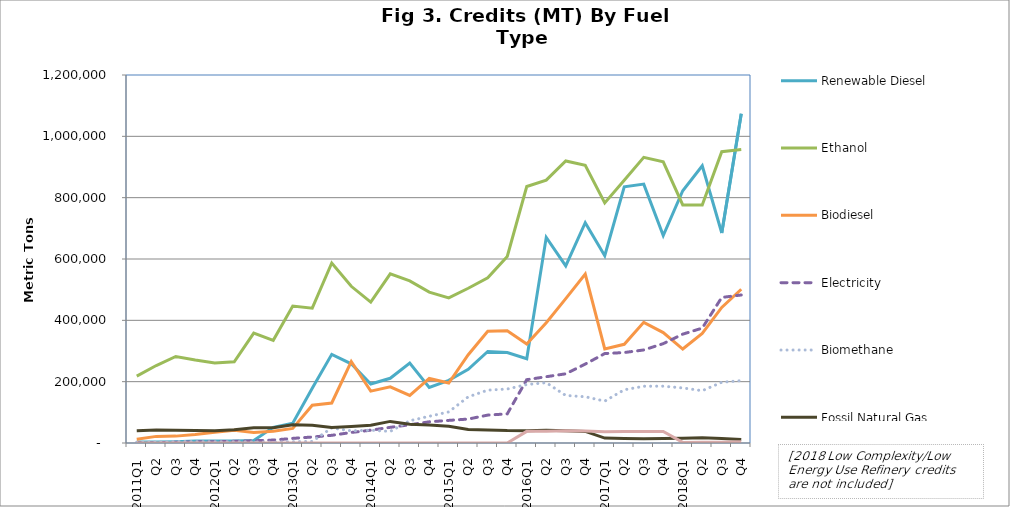
| Category | Renewable Diesel  | Ethanol | Biodiesel | Electricity | Biomethane | Fossil Natural Gas | Other (Hydrogen, Renewable Naphtha, Innovative Crude & Low Complexity / Low Energy Use Refining, etc.) |
|---|---|---|---|---|---|---|---|
| 2011Q1 | 3070 | 217913 | 12300 | 459 | 2212 | 39934 | 0 |
| Q2 | 3368 | 252550 | 21555 | 1293 | 3069 | 42169 | 0 |
| Q3 | 4362 | 282189 | 22424 | 2455 | 4960 | 41443 | 0 |
| Q4 | 6220 | 270901 | 27988 | 3536 | 4474 | 40844 | 0 |
| 2012Q1 | 6701 | 261269 | 35382 | 4519 | 4367 | 40226 | 0 |
| Q2 | 6804 | 264615 | 41919 | 5560 | 4221 | 43158 | 0 |
| Q3 | 7938 | 358459 | 34052 | 7294 | 3577 | 49942 | 0 |
| Q4 | 51216 | 334751 | 37994 | 9611 | 2680 | 49844 | 0 |
| 2013Q1 | 64445 | 446344 | 47386 | 15051 | 4240 | 59246 | 0 |
| Q2 | 178293 | 439633 | 123072 | 19516 | 5180 | 58052 | 0 |
| Q3 | 288998 | 586902 | 130475 | 25039 | 49115 | 50834 | 0 |
| Q4 | 258193 | 510999 | 265737 | 34347 | 39534 | 53816 | 0 |
| 2014Q1 | 192407 | 459238 | 169218 | 41753 | 41704 | 57704 | 0 |
| Q2 | 211004 | 551332 | 183308 | 51092 | 37832 | 70435 | 0 |
| Q3 | 260522 | 528433 | 154934 | 59366 | 72480 | 60886 | 0 |
| Q4 | 181046 | 491880 | 210540 | 69119 | 87230 | 58340 | 0 |
| 2015Q1 | 204352 | 473209 | 195615 | 73708 | 101324 | 54423 | 0 |
| Q2 | 240167 | 504542 | 287973 | 78072 | 150581 | 43984 | 0 |
| Q3 | 298591 | 538519 | 364501 | 91036 | 172350 | 42638 | 50 |
| Q4 | 295061 | 608484 | 365821 | 94924 | 175955 | 40464 | 24 |
| 2016Q1 | 274568 | 836350 | 322607 | 206464 | 190598 | 39883 | 37975 |
| Q2 | 670559 | 857168 | 392318 | 216149 | 196777 | 41523 | 38243 |
| Q3 | 577586 | 919750 | 470922 | 225640 | 154977 | 40001 | 39843 |
| Q4 | 718504 | 905839 | 550936 | 257321 | 150868 | 37812 | 39493 |
| 2017Q1 | 610652 | 783039 | 306640 | 291645 | 136639 | 16032 | 37028 |
| Q2 | 835625 | 856950 | 321909 | 295010 | 173392 | 14344 | 37617 |
| Q3 | 844159 | 931601 | 393587 | 303385 | 185138 | 14061 | 37717 |
| Q4 | 676294 | 916634 | 359942 | 324060 | 185261 | 14298 | 37644 |
| 2018Q1 | 822711 | 776336 | 306393 | 354930 | 179507 | 15294 | 2008 |
| Q2 | 904125 | 775942 | 357446 | 374672 | 170495 | 16966 | 2527 |
| Q3 | 684773 | 949941 | 442007 | 474631 | 197971 | 14905 | 2679 |
| Q4 | 1073901 | 956765 | 501294 | 482624 | 203315 | 11605 | 3855 |